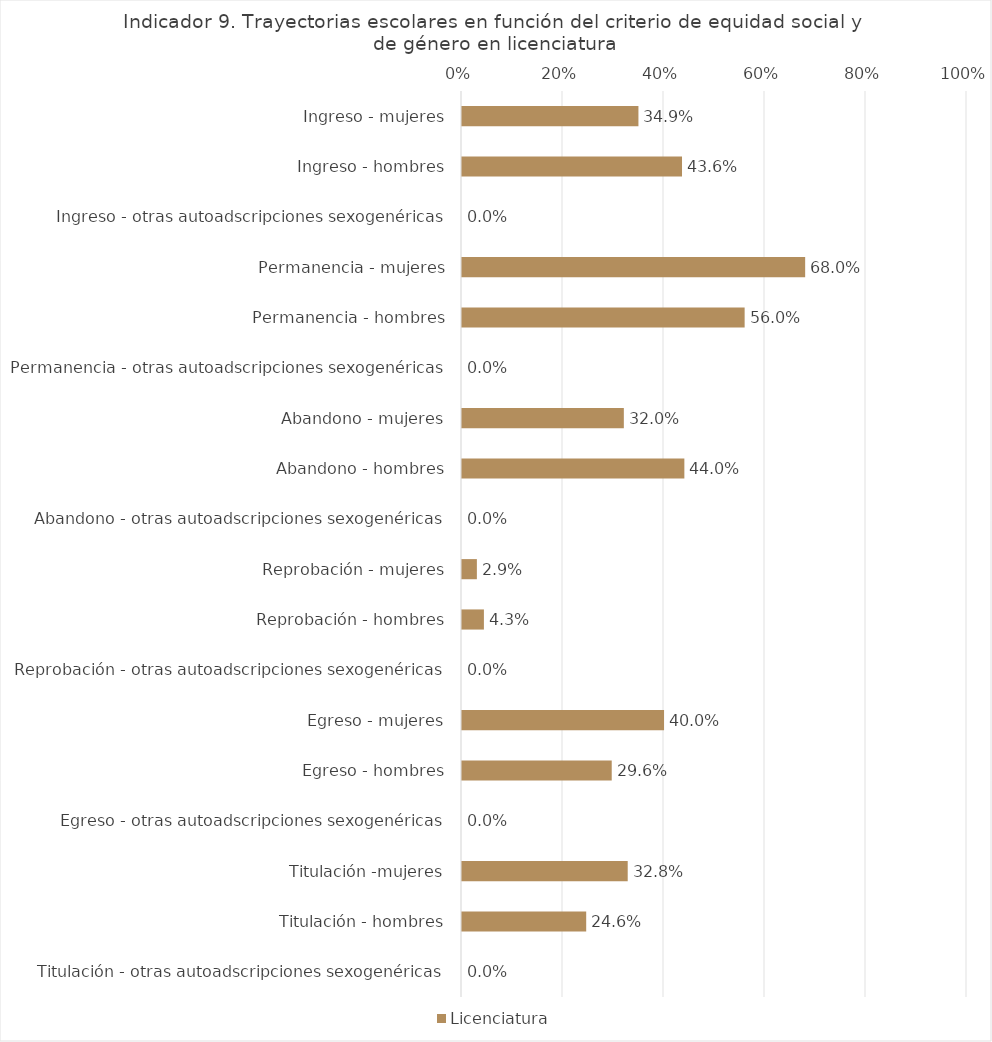
| Category | Licenciatura |
|---|---|
| Ingreso - mujeres | 0.349 |
| Ingreso - hombres | 0.436 |
| Ingreso - otras autoadscripciones sexogenéricas | 0 |
| Permanencia - mujeres | 0.68 |
| Permanencia - hombres | 0.56 |
| Permanencia - otras autoadscripciones sexogenéricas | 0 |
| Abandono - mujeres | 0.32 |
| Abandono - hombres | 0.44 |
| Abandono - otras autoadscripciones sexogenéricas | 0 |
| Reprobación - mujeres | 0.029 |
| Reprobación - hombres | 0.043 |
| Reprobación - otras autoadscripciones sexogenéricas | 0 |
| Egreso - mujeres | 0.4 |
| Egreso - hombres | 0.296 |
| Egreso - otras autoadscripciones sexogenéricas | 0 |
| Titulación -mujeres | 0.328 |
| Titulación - hombres | 0.246 |
| Titulación - otras autoadscripciones sexogenéricas | 0 |